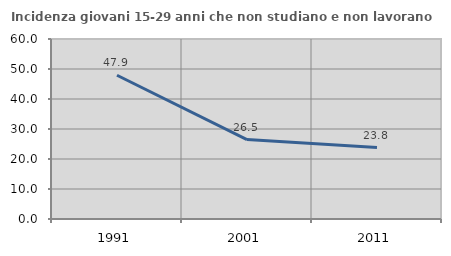
| Category | Incidenza giovani 15-29 anni che non studiano e non lavorano  |
|---|---|
| 1991.0 | 47.912 |
| 2001.0 | 26.471 |
| 2011.0 | 23.832 |